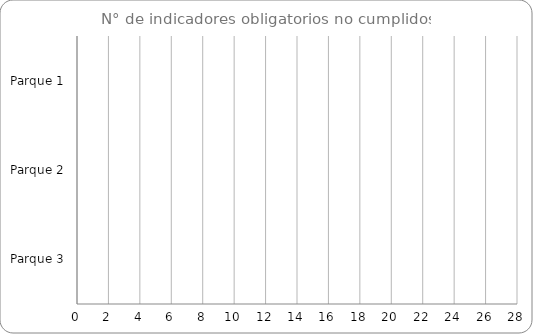
| Category | Indicadores obligatorios primarios | Indicadores obligatorios secundarios |
|---|---|---|
| Parque 1 | 0 | 0 |
| Parque 2 | 0 | 0 |
| Parque 3 | 0 | 0 |